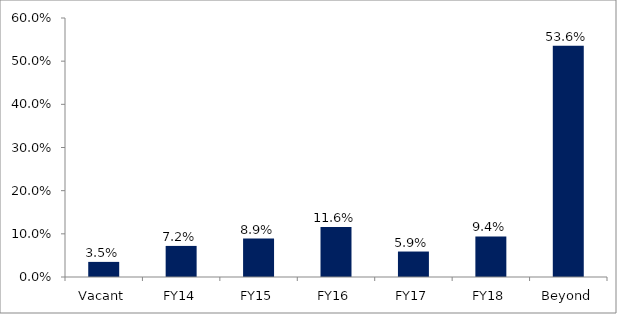
| Category | Series 0 |
|---|---|
| Vacant | 0.035 |
| FY14 | 0.072 |
| FY15 | 0.089 |
| FY16 | 0.116 |
| FY17 | 0.059 |
| FY18 | 0.094 |
| Beyond | 0.536 |